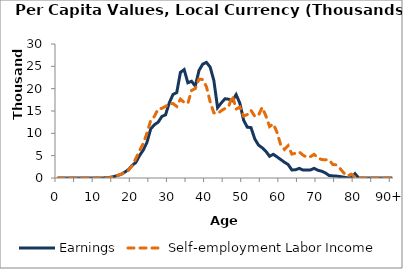
| Category | Earnings | Self-employment Labor Income |
|---|---|---|
| 0 | 0 | 0 |
|  | 0 | 0 |
| 2 | 0 | 0 |
| 3 | 0 | 0 |
| 4 | 0 | 0 |
| 5 | 0 | 0 |
| 6 | 0 | 0 |
| 7 | 0 | 0 |
| 8 | 0 | 0 |
| 9 | 0 | 0 |
| 10 | 7.647 | 0.701 |
| 11 | 11.327 | 1.297 |
| 12 | 19.87 | 6.02 |
| 13 | 41.959 | 8.946 |
| 14 | 144.746 | 98.169 |
| 15 | 296.729 | 185.681 |
| 16 | 545.245 | 525.536 |
| 17 | 818.782 | 834.749 |
| 18 | 1301.197 | 1199.57 |
| 19 | 1880.815 | 1709.027 |
| 20 | 2807.601 | 2755.883 |
| 21 | 3482.975 | 4363.181 |
| 22 | 5034.194 | 6149.637 |
| 23 | 6262.735 | 7761.501 |
| 24 | 7999.219 | 10061.451 |
| 25 | 10991.821 | 12899.725 |
| 26 | 11927.174 | 13790.635 |
| 27 | 12491.765 | 15474.222 |
| 28 | 13767.658 | 15591.35 |
| 29 | 14152.016 | 16038.91 |
| 30 | 16818.017 | 16540.349 |
| 31 | 18711.926 | 16679.842 |
| 32 | 19109.267 | 16024.338 |
| 33 | 23653.895 | 17654.383 |
| 34 | 24267.596 | 16919.335 |
| 35 | 21314.562 | 16714.071 |
| 36 | 21666.013 | 19615.585 |
| 37 | 20563.492 | 20033.141 |
| 38 | 24072.728 | 22148.035 |
| 39 | 25490.675 | 22024.81 |
| 40 | 25881.019 | 20459.158 |
| 41 | 24835.452 | 17065.679 |
| 42 | 21824.111 | 14587.593 |
| 43 | 15744.926 | 14405.022 |
| 44 | 16806.061 | 15079.191 |
| 45 | 17738.749 | 15568.611 |
| 46 | 17638.263 | 16051.584 |
| 47 | 17306.048 | 18413.878 |
| 48 | 18676.012 | 15415.121 |
| 49 | 16729.279 | 15899.319 |
| 50 | 12970.895 | 13865.654 |
| 51 | 11371.683 | 14210.332 |
| 52 | 11283.109 | 15151.77 |
| 53 | 8766.591 | 13818.328 |
| 54 | 7392.324 | 13988.767 |
| 55 | 6769.196 | 15805.366 |
| 56 | 5972.057 | 13915.36 |
| 57 | 4873.295 | 11518.31 |
| 58 | 5295.292 | 12119.83 |
| 59 | 4736.214 | 10243.341 |
| 60 | 4132.846 | 7399.494 |
| 61 | 3531.83 | 6389.628 |
| 62 | 3011.597 | 7231.283 |
| 63 | 1795.829 | 5346.228 |
| 64 | 1846.522 | 5553.504 |
| 65 | 2159.016 | 5823.925 |
| 66 | 1775.957 | 5130.402 |
| 67 | 1809.956 | 4640.769 |
| 68 | 1800.929 | 4781.735 |
| 69 | 2162.093 | 5288.746 |
| 70 | 1726.581 | 4491.806 |
| 71 | 1528.064 | 4131.07 |
| 72 | 1149.049 | 4075.35 |
| 73 | 573.384 | 4093.113 |
| 74 | 470.604 | 3032.527 |
| 75 | 428.589 | 2926.154 |
| 76 | 321.515 | 2096.42 |
| 77 | 178.245 | 1115.58 |
| 78 | 44.985 | 469.862 |
| 79 | 81.35 | 849.69 |
| 80 | 970.091 | 206.918 |
| 81 | 0 | 0 |
| 82 | 0 | 0 |
| 83 | 0 | 0 |
| 84 | 0 | 0 |
| 85 | 0 | 0 |
| 86 | 0 | 0 |
| 87 | 0 | 0 |
| 88 | 0 | 0 |
| 89 | 0 | 0 |
| 90+ | 0 | 0 |